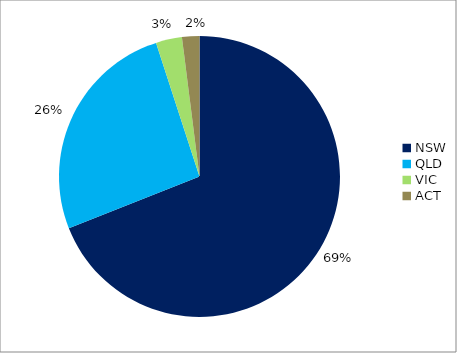
| Category | Series 0 |
|---|---|
| NSW | 0.69 |
| QLD | 0.26 |
| VIC | 0.03 |
| ACT | 0.02 |